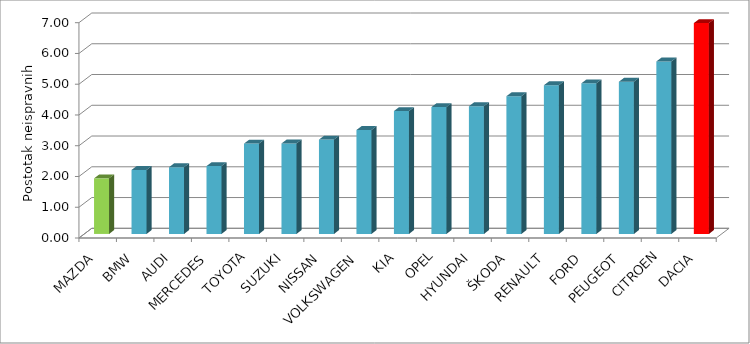
| Category | Series 4 |
|---|---|
| MAZDA | 1.807 |
| BMW | 2.082 |
| AUDI | 2.171 |
| MERCEDES | 2.207 |
| TOYOTA | 2.937 |
| SUZUKI | 2.941 |
| NISSAN | 3.067 |
| VOLKSWAGEN | 3.38 |
| KIA | 3.996 |
| OPEL | 4.124 |
| HYUNDAI | 4.153 |
| ŠKODA | 4.478 |
| RENAULT | 4.835 |
| FORD | 4.898 |
| PEUGEOT | 4.949 |
| CITROEN | 5.609 |
| DACIA | 6.856 |